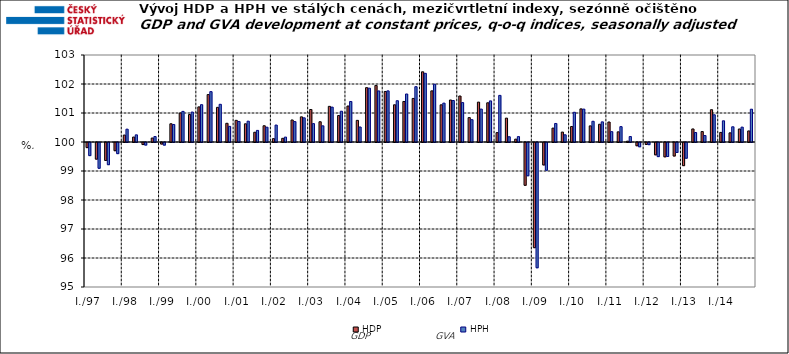
| Category | HDP

 | HPH

 |
|---|---|---|
| I./97 | 99.824 | 99.548 |
|  | 99.426 | 99.111 |
|  | 99.381 | 99.235 |
|  | 99.717 | 99.616 |
| I./98 | 100.239 | 100.443 |
|  | 100.171 | 100.246 |
|  | 99.929 | 99.911 |
|  | 100.137 | 100.188 |
| I./99 | 99.947 | 99.91 |
|  | 100.628 | 100.604 |
|  | 100.999 | 101.055 |
|  | 100.948 | 101.033 |
| I./00 | 101.211 | 101.287 |
|  | 101.635 | 101.737 |
|  | 101.195 | 101.3 |
|  | 100.645 | 100.54 |
| I./01 | 100.746 | 100.708 |
|  | 100.628 | 100.718 |
|  | 100.336 | 100.4 |
|  | 100.56 | 100.51 |
| I./02 | 100.116 | 100.584 |
|  | 100.127 | 100.169 |
|  | 100.76 | 100.704 |
|  | 100.867 | 100.833 |
| I./03 | 101.121 | 100.633 |
|  | 100.698 | 100.558 |
|  | 101.229 | 101.203 |
|  | 100.913 | 101.061 |
| I./04 | 101.241 | 101.397 |
|  | 100.747 | 100.518 |
|  | 101.874 | 101.856 |
|  | 101.951 | 101.761 |
| I./05 | 101.743 | 101.763 |
|  | 101.283 | 101.424 |
|  | 101.397 | 101.656 |
|  | 101.502 | 101.907 |
| I./06 | 102.421 | 102.368 |
|  | 101.763 | 101.992 |
|  | 101.282 | 101.34 |
|  | 101.448 | 101.431 |
| I./07 | 101.586 | 101.359 |
|  | 100.841 | 100.77 |
|  | 101.375 | 101.135 |
|  | 101.352 | 101.417 |
| I./08 | 100.323 | 101.608 |
|  | 100.823 | 100.181 |
|  | 100.099 | 100.185 |
|  | 98.525 | 98.853 |
| I./09 | 96.373 | 95.68 |
|  | 99.226 | 99.043 |
|  | 100.479 | 100.639 |
|  | 100.343 | 100.248 |
| I./10 | 100.535 | 101.025 |
|  | 101.142 | 101.135 |
|  | 100.556 | 100.715 |
|  | 100.612 | 100.694 |
| I./11 | 100.69 | 100.357 |
|  | 100.351 | 100.53 |
|  | 100.029 | 100.188 |
|  | 99.888 | 99.853 |
| I./12 | 99.932 | 99.926 |
|  | 99.574 | 99.513 |
|  | 99.506 | 99.516 |
|  | 99.534 | 99.656 |
| I./13 | 99.202 | 99.458 |
|  | 100.45 | 100.327 |
|  | 100.36 | 100.223 |
|  | 101.113 | 100.939 |
| I./14 | 100.33 | 100.73 |